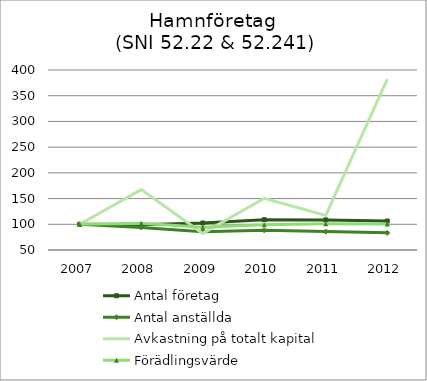
| Category | Antal företag | Antal anställda | Avkastning på totalt kapital | Förädlingsvärde |
|---|---|---|---|---|
| 0 | 100 | 100 | 100 | 100 |
| 1 | 99.291 | 93.848 | 167.459 | 101.855 |
| 2 | 102.482 | 85.61 | 82.286 | 94.002 |
| 3 | 108.865 | 88.195 | 150.604 | 99.233 |
| 4 | 108.511 | 85.812 | 117.115 | 100.903 |
| 5 | 106.383 | 83.305 | 382.052 | 100.441 |